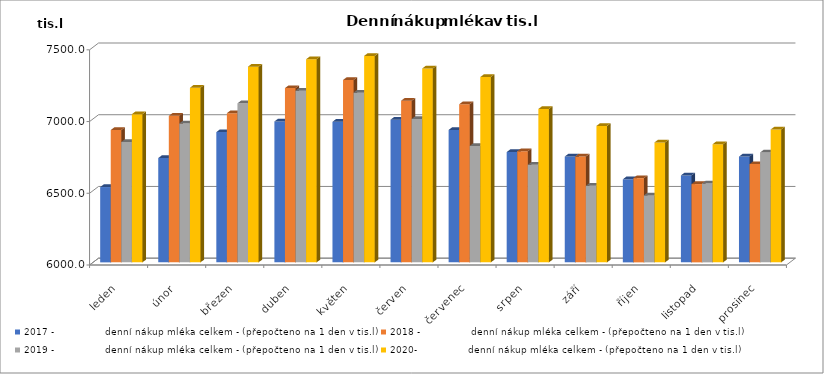
| Category | 2017 -                 denní nákup mléka celkem - (přepočteno na 1 den v tis.l) | 2018 -                 denní nákup mléka celkem - (přepočteno na 1 den v tis.l) | 2019 -                 denní nákup mléka celkem - (přepočteno na 1 den v tis.l) | 2020-                 denní nákup mléka celkem - (přepočteno na 1 den v tis.l) |
|---|---|---|---|---|
| leden | 6525.032 | 6922.548 | 6839.323 | 7033.097 |
| únor | 6727.179 | 7021.429 | 6968.714 | 7217.414 |
| březen | 6908 | 7040 | 7108.581 | 7364.29 |
| duben | 6982.133 | 7214.767 | 7197 | 7415.749 |
| květen | 6980.226 | 7271.226 | 7183.194 | 7439.452 |
| červen | 6994.7 | 7127.1 | 6999.633 | 7351.567 |
| červenec | 6923.258 | 7102.129 | 6811.871 | 7292.097 |
| srpen | 6768.903 | 6774.548 | 6680.129 | 7069.129 |
| září | 6738.1 | 6738.8 | 6533.667 | 6951.267 |
| říjen | 6579.097 | 6587.323 | 6466.968 | 6836.387 |
| listopad | 6606.267 | 6545.8 | 6549.667 | 6823.533 |
| prosinec | 6737.484 | 6684.903 | 6765.839 | 6926.161 |